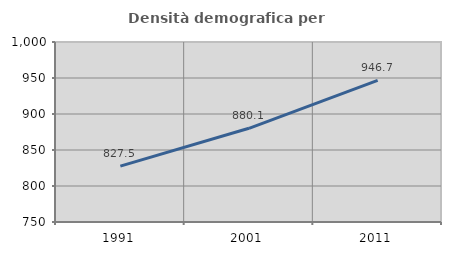
| Category | Densità demografica |
|---|---|
| 1991.0 | 827.547 |
| 2001.0 | 880.143 |
| 2011.0 | 946.725 |